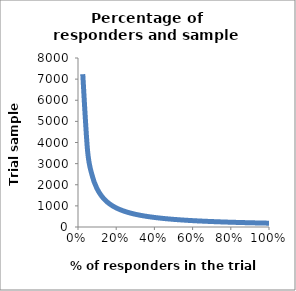
| Category | sample size |
|---|---|
| 1.0 | 180.849 |
| 0.975 | 185.486 |
| 0.95 | 190.367 |
| 0.9249999999999999 | 195.512 |
| 0.8999999999999999 | 200.943 |
| 0.8749999999999999 | 206.684 |
| 0.8499999999999999 | 212.763 |
| 0.8249999999999998 | 219.211 |
| 0.7999999999999998 | 226.061 |
| 0.7749999999999998 | 233.353 |
| 0.7499999999999998 | 241.132 |
| 0.7249999999999998 | 249.447 |
| 0.6999999999999997 | 258.356 |
| 0.6749999999999997 | 267.924 |
| 0.6499999999999997 | 278.229 |
| 0.6249999999999997 | 289.358 |
| 0.5999999999999996 | 301.415 |
| 0.5749999999999996 | 314.52 |
| 0.5499999999999996 | 328.816 |
| 0.5249999999999996 | 344.474 |
| 0.49999999999999956 | 361.698 |
| 0.47499999999999953 | 380.734 |
| 0.4499999999999995 | 401.886 |
| 0.4249999999999995 | 425.527 |
| 0.39999999999999947 | 452.122 |
| 0.37499999999999944 | 482.264 |
| 0.3499999999999994 | 516.711 |
| 0.3249999999999994 | 556.458 |
| 0.2999999999999994 | 602.83 |
| 0.27499999999999936 | 657.632 |
| 0.24999999999999936 | 723.395 |
| 0.22499999999999937 | 803.773 |
| 0.19999999999999937 | 904.244 |
| 0.17499999999999938 | 1033.422 |
| 0.14999999999999938 | 1205.659 |
| 0.12499999999999939 | 1446.791 |
| 0.0999999999999994 | 1808.489 |
| 0.0749999999999994 | 2411.318 |
| 0.0499999999999994 | 3616.977 |
| 0.024999999999999398 | 7233.955 |